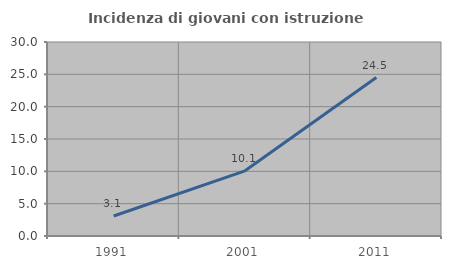
| Category | Incidenza di giovani con istruzione universitaria |
|---|---|
| 1991.0 | 3.093 |
| 2001.0 | 10.078 |
| 2011.0 | 24.51 |